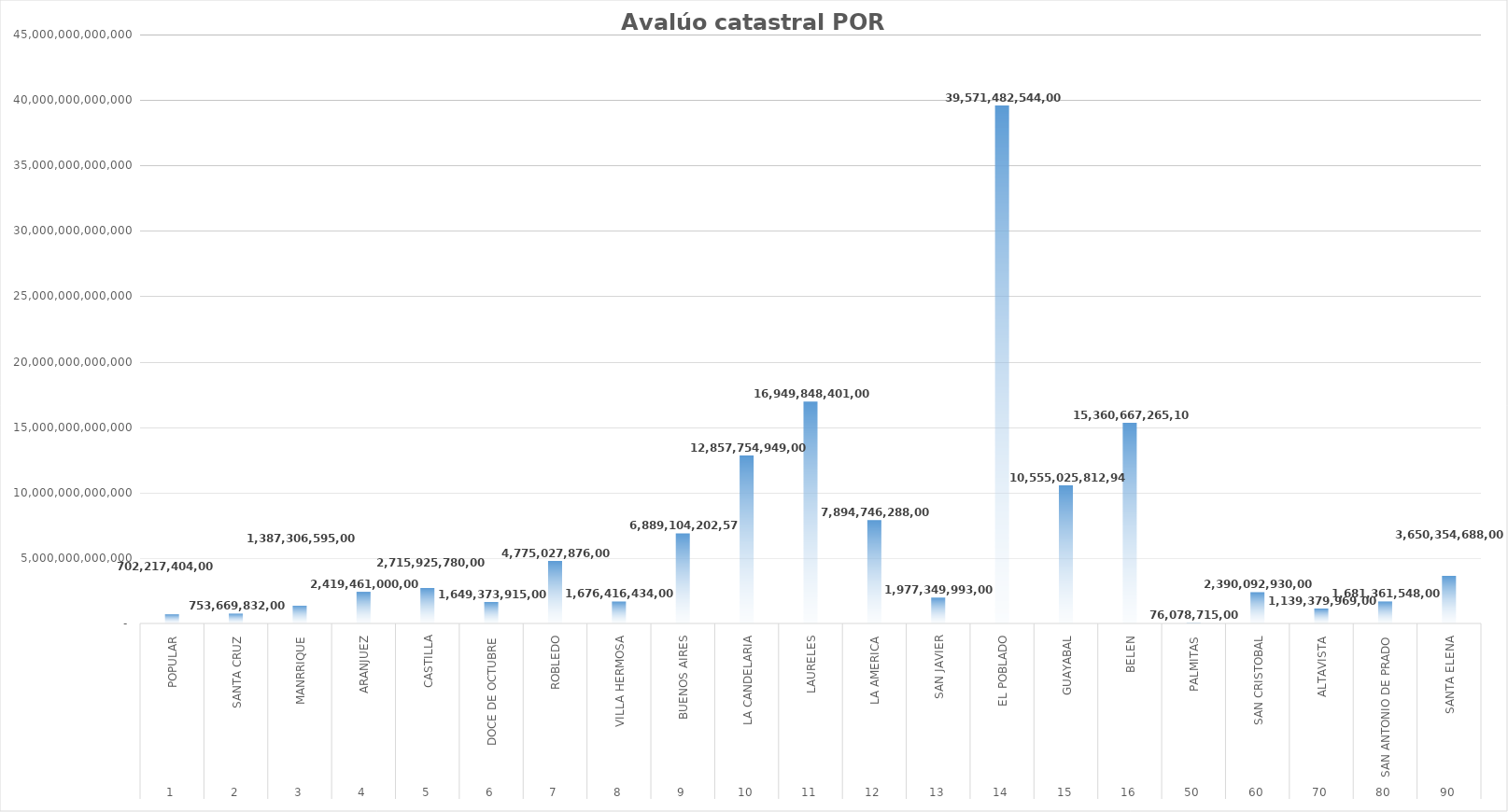
| Category | Avalúo Total |
|---|---|
| 0 | 702217404000 |
| 1 | 753669832000 |
| 2 | 1387306595000 |
| 3 | 2419461000000 |
| 4 | 2715925780000 |
| 5 | 1649373915000 |
| 6 | 4775027876000 |
| 7 | 1676416434000 |
| 8 | 6889104202577 |
| 9 | 12857754949000 |
| 10 | 16949848401000 |
| 11 | 7894746288003 |
| 12 | 1977349993000 |
| 13 | 39571482544000 |
| 14 | 10555025812946 |
| 15 | 15360667265101 |
| 16 | 76078715000 |
| 17 | 2390092930000 |
| 18 | 1139379969000 |
| 19 | 1681361548000 |
| 20 | 3650354688000 |